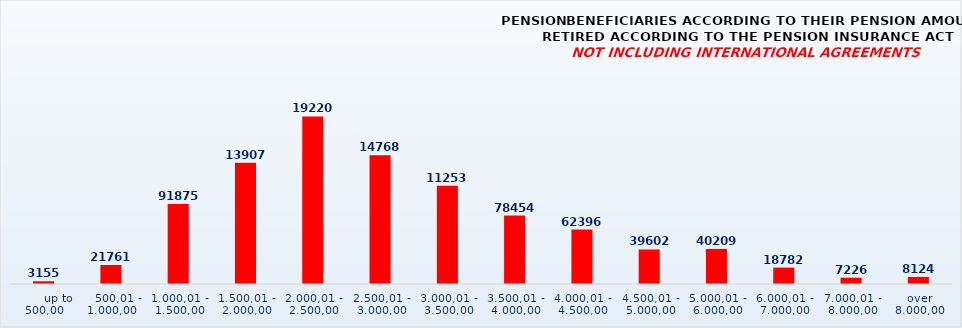
| Category | PENSION BENEFICIARIES ACCORDING TO TYPES AND AMOUNTS OF PENSION, RETIRED ACCORDING TO THE PENSION INSURANCE ACT
NOT INCLUDING INTERNATIONAL AGREEMENTS |
|---|---|
|       up to 500,00 | 3155 |
|    500,01 - 1.000,00 | 21761 |
| 1.000,01 - 1.500,00 | 91875 |
| 1.500,01 - 2.000,00 | 139072 |
| 2.000,01 - 2.500,00 | 192209 |
| 2.500,01 - 3.000,00 | 147683 |
| 3.000,01 - 3.500,00 | 112531 |
| 3.500,01 - 4.000,00 | 78454 |
| 4.000,01 - 4.500,00 | 62396 |
| 4.500,01 - 5.000,00 | 39602 |
| 5.000,01 - 6.000,00 | 40209 |
| 6.000,01 - 7.000,00 | 18782 |
| 7.000,01 - 8.000,00 | 7226 |
|  over  8.000,00 | 8124 |